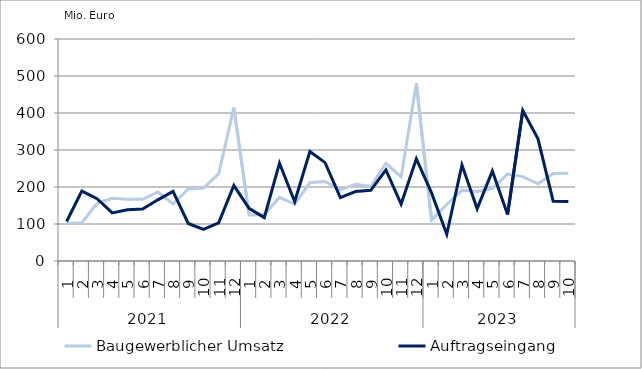
| Category | Baugewerblicher Umsatz | Auftragseingang |
|---|---|---|
| 0 | 101295.895 | 106850.127 |
| 1 | 103236.543 | 188883.434 |
| 2 | 156172.725 | 168204.42 |
| 3 | 169257.088 | 130052.073 |
| 4 | 166897.821 | 138492.214 |
| 5 | 166720.216 | 140262.426 |
| 6 | 186515.191 | 165331.191 |
| 7 | 154188.941 | 188169.655 |
| 8 | 194464.12 | 101359.538 |
| 9 | 197281.201 | 85626.862 |
| 10 | 235325.083 | 102880.924 |
| 11 | 414469.471 | 203900.676 |
| 12 | 124217.549 | 142351.759 |
| 13 | 125619.696 | 117194.423 |
| 14 | 171896.664 | 264509.013 |
| 15 | 153384.654 | 160146.519 |
| 16 | 211335.38 | 295997.826 |
| 17 | 214914.164 | 265813.917 |
| 18 | 192047.613 | 171529.517 |
| 19 | 207577.681 | 187809.656 |
| 20 | 201109.781 | 190941.096 |
| 21 | 264135.048 | 246250.021 |
| 22 | 227299.047 | 153783.993 |
| 23 | 480026.589 | 276019.328 |
| 24 | 110408.991 | 184068.731 |
| 25 | 152702.87 | 72330.186 |
| 26 | 191677.032 | 259741.102 |
| 27 | 187876.702 | 141464.389 |
| 28 | 195815.34 | 243069.898 |
| 29 | 234759.067 | 125882.939 |
| 30 | 228043.08 | 406932.293 |
| 31 | 208510.786 | 330128.024 |
| 32 | 236511.503 | 161760.047 |
| 33 | 237275.194 | 161029.305 |